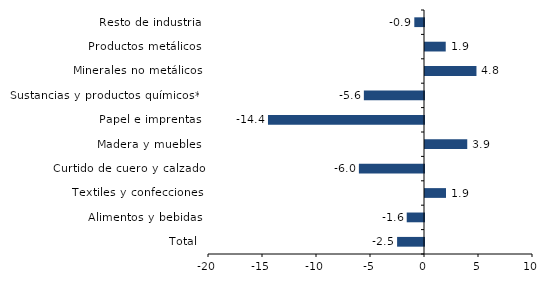
| Category | Series 0 |
|---|---|
| Total | -2.492 |
| Alimentos y bebidas | -1.6 |
| Textiles y confecciones | 1.943 |
| Curtido de cuero y calzado | -6.028 |
| Madera y muebles | 3.912 |
| Papel e imprentas | -14.445 |
| Sustancias y productos químicos** | -5.568 |
| Minerales no metálicos | 4.765 |
| Productos metálicos | 1.919 |
| Resto de industria | -0.897 |